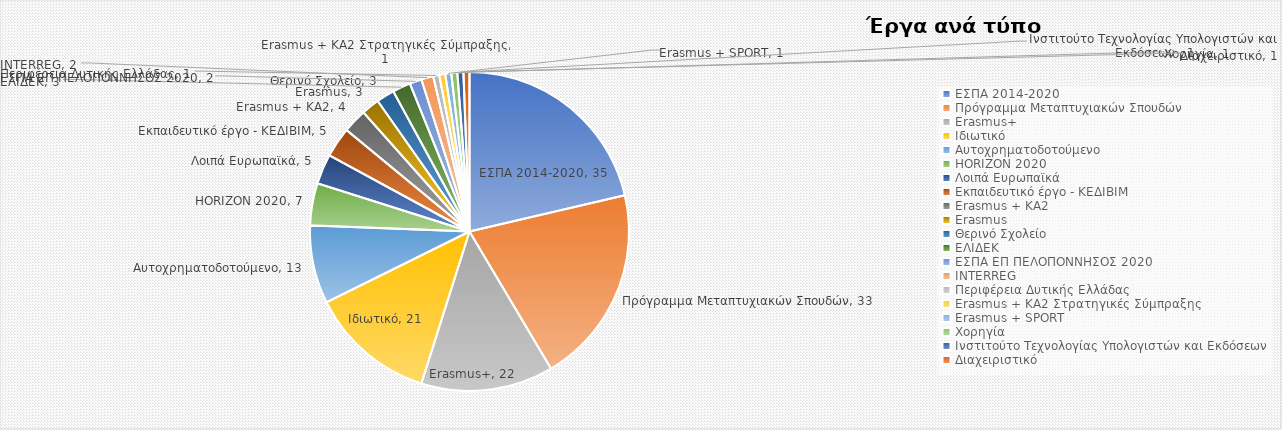
| Category | Έργα |
|---|---|
| ΕΣΠΑ 2014-2020 | 35 |
| Πρόγραμμα Μεταπτυχιακών Σπουδών | 33 |
| Erasmus+ | 22 |
| Ιδιωτικό | 21 |
| Αυτοχρηματοδοτούμενο | 13 |
| HORIZON 2020 | 7 |
| Λοιπά Ευρωπαϊκά | 5 |
| Εκπαιδευτικό έργο - ΚΕΔΙΒΙΜ | 5 |
| Erasmus + KA2 | 4 |
| Erasmus | 3 |
| Θερινό Σχολείο | 3 |
| ΕΛΙΔΕΚ | 3 |
| ΕΣΠΑ ΕΠ ΠΕΛΟΠΟΝΝΗΣΟΣ 2020 | 2 |
| INTERREG | 2 |
| Περιφέρεια Δυτικής Ελλάδας | 1 |
| Erasmus + KA2 Στρατηγικές Σύμπραξης | 1 |
| Erasmus + SPORT | 1 |
| Χορηγία | 1 |
| Ινστιτούτο Τεχνολογίας Υπολογιστών και Εκδόσεων  | 1 |
| Διαχειριστικό | 1 |